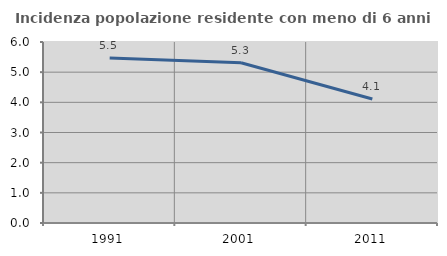
| Category | Incidenza popolazione residente con meno di 6 anni |
|---|---|
| 1991.0 | 5.473 |
| 2001.0 | 5.311 |
| 2011.0 | 4.112 |